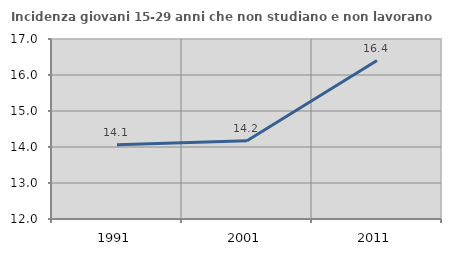
| Category | Incidenza giovani 15-29 anni che non studiano e non lavorano  |
|---|---|
| 1991.0 | 14.065 |
| 2001.0 | 14.175 |
| 2011.0 | 16.402 |